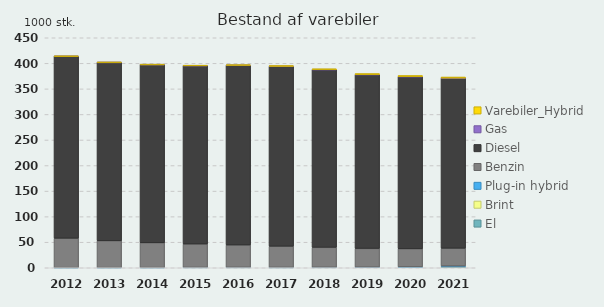
| Category | El | Brint | Plug-in hybrid | Benzin | Diesel | Gas | Varebiler_Hybrid |
|---|---|---|---|---|---|---|---|
| 2012 | 0.22 | 0 | 0.01 | 57.67 | 355.91 | 0.03 | 0.04 |
| 2013 | 0.31 | 0 | 0.01 | 52.52 | 348.91 | 0.03 | 0.09 |
| 2014 | 0.35 | 0 | 0.01 | 48.55 | 348.42 | 0.06 | 0.22 |
| 2015 | 0.59 | 0 | 0.1 | 45.81 | 348.77 | 0.07 | 0.51 |
| 2016 | 0.62 | 0 | 0.18 | 43.83 | 351.48 | 0.09 | 0.88 |
| 2017 | 0.51 | 0 | 0.2 | 41.51 | 351.86 | 0.14 | 1.3 |
| 2018 | 0.67 | 0 | 0.23 | 39.02 | 347.58 | 0.14 | 1.69 |
| 2019 | 0.9 | 0 | 0.26 | 36.62 | 339.99 | 0.14 | 2.08 |
| 2020 | 1.32 | 0 | 0.43 | 35.38 | 336.58 | 0.15 | 2.38 |
| 2021 | 2.64 | 0 | 0.78 | 34.9 | 332.73 | 0.14 | 2.07 |